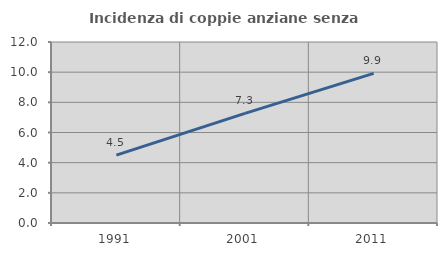
| Category | Incidenza di coppie anziane senza figli  |
|---|---|
| 1991.0 | 4.499 |
| 2001.0 | 7.265 |
| 2011.0 | 9.922 |